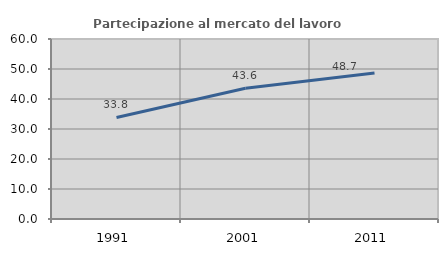
| Category | Partecipazione al mercato del lavoro  femminile |
|---|---|
| 1991.0 | 33.84 |
| 2001.0 | 43.592 |
| 2011.0 | 48.665 |